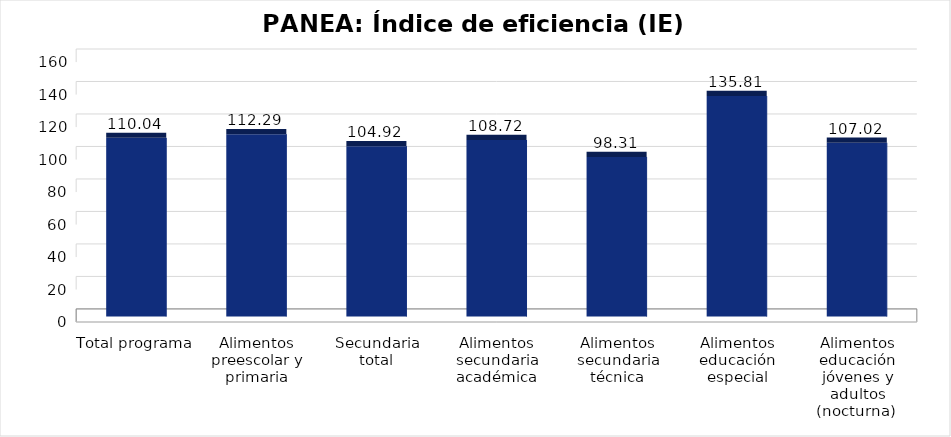
| Category | Índice de eficiencia (IE)  |
|---|---|
| Total programa | 110.037 |
| Alimentos preescolar y primaria | 112.291 |
| Secundaria total | 104.916 |
| Alimentos secundaria académica | 108.721 |
| Alimentos secundaria técnica | 98.306 |
| Alimentos educación especial | 135.811 |
| Alimentos educación jóvenes y adultos (nocturna)  | 107.023 |